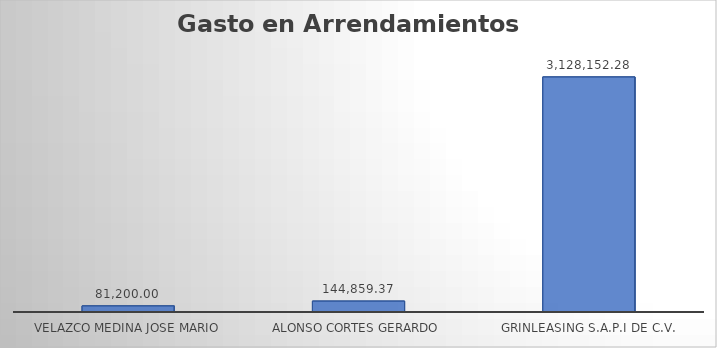
| Category | Monto  |
|---|---|
| VELAZCO MEDINA JOSE MARIO | 81200 |
| ALONSO CORTES GERARDO | 144859.37 |
| GRINLEASING S.A.P.I DE C.V. | 3128152.28 |